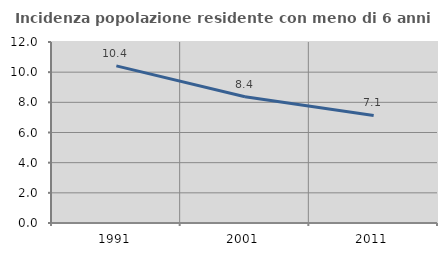
| Category | Incidenza popolazione residente con meno di 6 anni |
|---|---|
| 1991.0 | 10.416 |
| 2001.0 | 8.373 |
| 2011.0 | 7.133 |